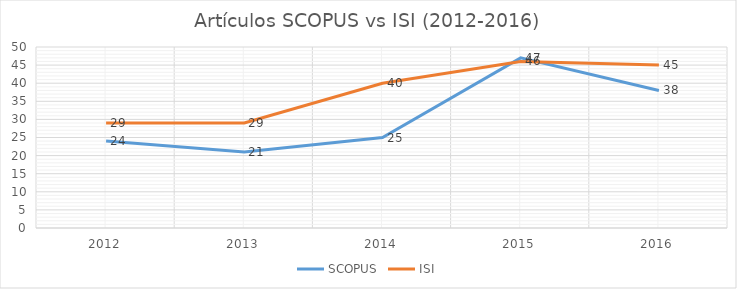
| Category | SCOPUS | ISI |
|---|---|---|
| 2012.0 | 24 | 29 |
| 2013.0 | 21 | 29 |
| 2014.0 | 25 | 40 |
| 2015.0 | 47 | 46 |
| 2016.0 | 38 | 45 |